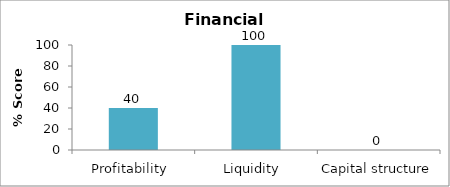
| Category | Series 0 |
|---|---|
| Profitability  | 40 |
| Liquidity  | 100 |
| Capital structure | 0 |